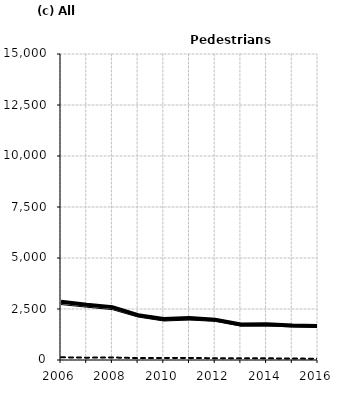
| Category | Built-up | Non built-up | Total |
|---|---|---|---|
| 2006.0 | 2719 | 134 | 2853 |
| 2007.0 | 2589 | 115 | 2704 |
| 2008.0 | 2469 | 124 | 2593 |
| 2009.0 | 2107 | 92 | 2199 |
| 2010.0 | 1911 | 102 | 2013 |
| 2011.0 | 1961 | 103 | 2064 |
| 2012.0 | 1893 | 86 | 1979 |
| 2013.0 | 1663 | 82 | 1745 |
| 2014.0 | 1668 | 83 | 1751 |
| 2015.0 | 1623 | 71 | 1694 |
| 2016.0 | 1603 | 63 | 1666 |